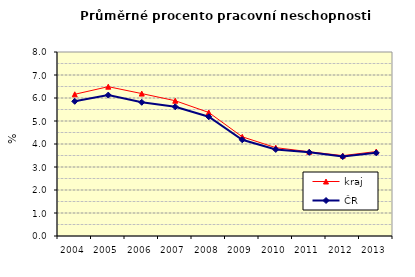
| Category | kraj | ČR |
|---|---|---|
| 2004.0 | 6.161 | 5.857 |
| 2005.0 | 6.492 | 6.126 |
| 2006.0 | 6.192 | 5.814 |
| 2007.0 | 5.882 | 5.619 |
| 2008.0 | 5.371 | 5.184 |
| 2009.0 | 4.313 | 4.184 |
| 2010.0 | 3.841 | 3.763 |
| 2011.0 | 3.663 | 3.638 |
| 2012.0 | 3.494 | 3.452 |
| 2013.0 | 3.673 | 3.615 |